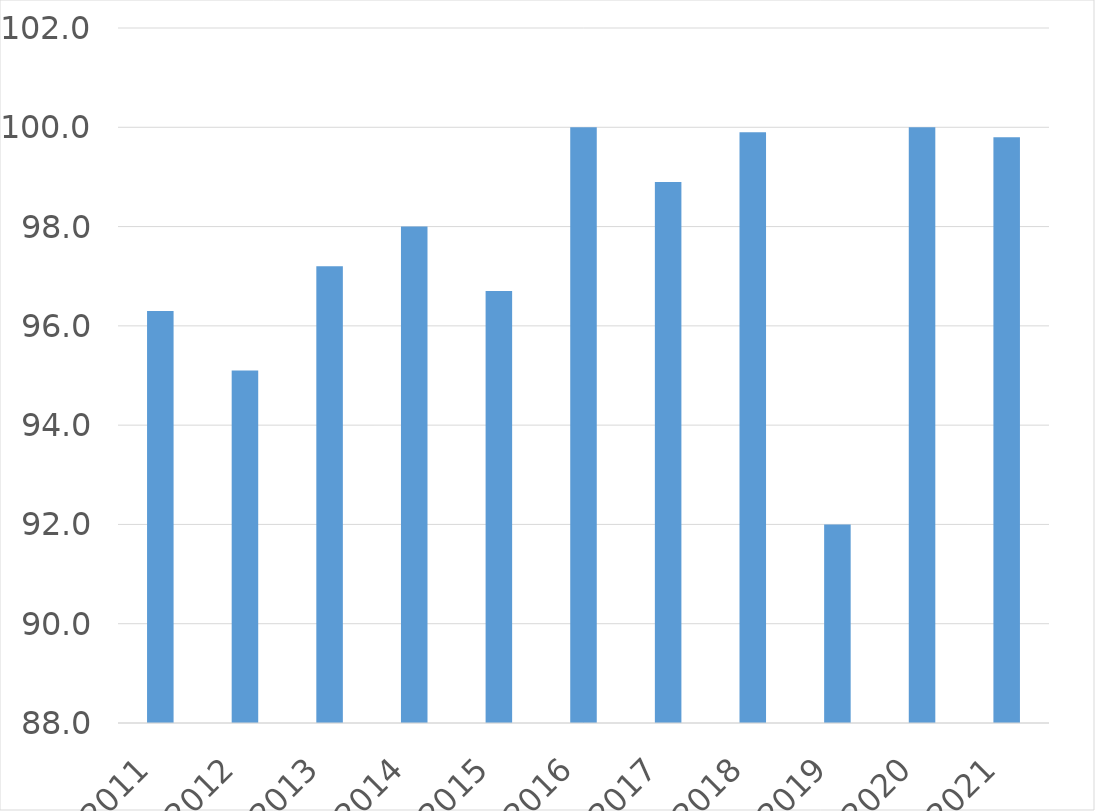
| Category | Series 0 |
|---|---|
| 2011 | 96.3 |
| 2012 | 95.1 |
| 2013 | 97.2 |
| 2014 | 98 |
| 2015 | 96.7 |
| 2016 | 100 |
| 2017 | 98.9 |
| 2018 | 99.9 |
| 2019 | 92 |
| 2020 | 100 |
| 2021 | 99.8 |